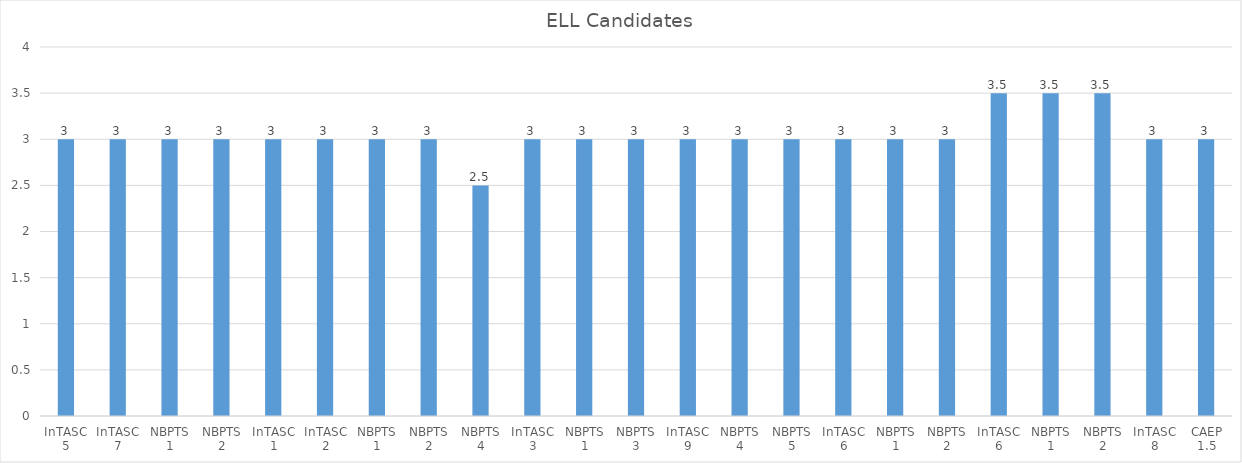
| Category | ELL |
|---|---|
| InTASC 5 | 3 |
| InTASC 7 | 3 |
| NBPTS 1 | 3 |
| NBPTS 2 | 3 |
| InTASC 1 | 3 |
| InTASC 2 | 3 |
| NBPTS 1 | 3 |
| NBPTS 2 | 3 |
| NBPTS 4 | 2.5 |
| InTASC 3 | 3 |
| NBPTS 1 | 3 |
| NBPTS 3 | 3 |
| InTASC 9 | 3 |
| NBPTS 4 | 3 |
| NBPTS 5 | 3 |
| InTASC 6 | 3 |
| NBPTS 1 | 3 |
| NBPTS 2 | 3 |
| InTASC 6 | 3.5 |
| NBPTS 1 | 3.5 |
| NBPTS 2 | 3.5 |
| InTASC 8 | 3 |
| CAEP 1.5 | 3 |